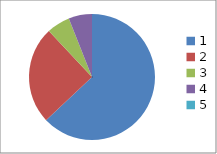
| Category | Series 0 |
|---|---|
| 0 | 0.63 |
| 1 | 0.25 |
| 2 | 0.06 |
| 3 | 0.06 |
| 4 | 0 |